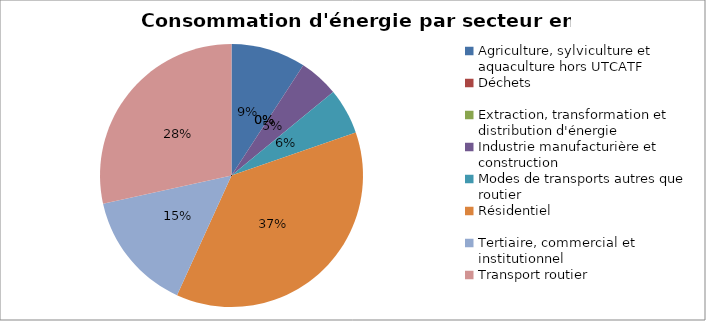
| Category | Series 0 |
|---|---|
| Agriculture, sylviculture et aquaculture hors UTCATF | 19736.7 |
| Déchets | 0 |
| Extraction, transformation et distribution d'énergie | 0 |
| Industrie manufacturière et construction | 10461.524 |
| Modes de transports autres que routier | 12084.23 |
| Résidentiel | 79640.234 |
| Tertiaire, commercial et institutionnel | 31678.128 |
| Transport routier | 61040.904 |